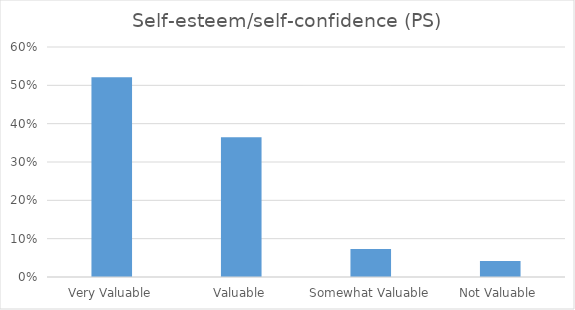
| Category | Self-esteem/self-confidence (PS) |
|---|---|
| Very Valuable | 0.521 |
| Valuable | 0.365 |
| Somewhat Valuable | 0.073 |
| Not Valuable | 0.042 |